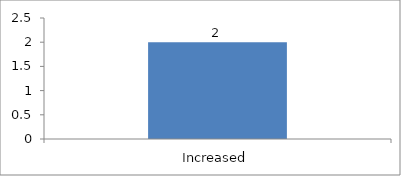
| Category | If no, should it be reduced or increased |
|---|---|
| Increased | 2 |